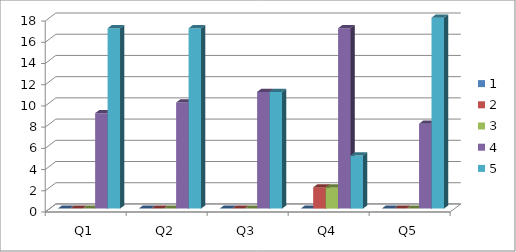
| Category | 1 | 2 | 3 | 4 | 5 |
|---|---|---|---|---|---|
| Q1 | 0 | 0 | 0 | 9 | 17 |
| Q2 | 0 | 0 | 0 | 10 | 17 |
| Q3 | 0 | 0 | 0 | 11 | 11 |
| Q4 | 0 | 2 | 2 | 17 | 5 |
| Q5 | 0 | 0 | 0 | 8 | 18 |